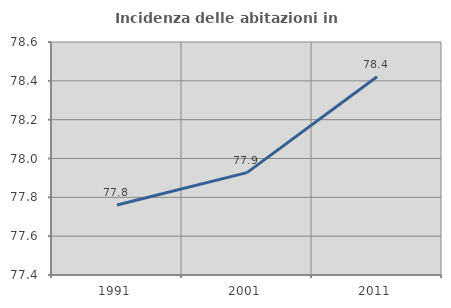
| Category | Incidenza delle abitazioni in proprietà  |
|---|---|
| 1991.0 | 77.76 |
| 2001.0 | 77.927 |
| 2011.0 | 78.421 |